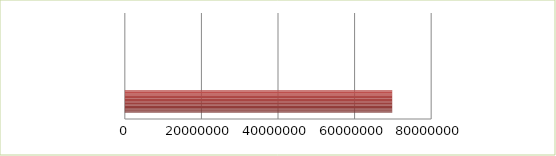
| Category | Series 0 | Series 1 |
|---|---|---|
| 0 | 2.5 | 69828918.272 |
| 1 | 2.6 | 0 |
| 2 | 2.7 | 0 |